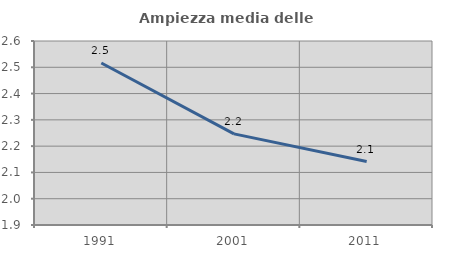
| Category | Ampiezza media delle famiglie |
|---|---|
| 1991.0 | 2.516 |
| 2001.0 | 2.247 |
| 2011.0 | 2.141 |